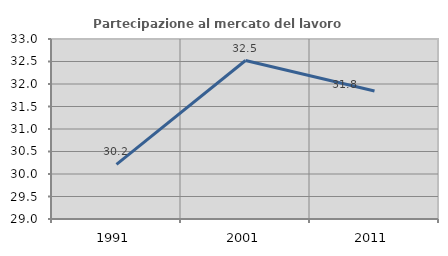
| Category | Partecipazione al mercato del lavoro  femminile |
|---|---|
| 1991.0 | 30.215 |
| 2001.0 | 32.522 |
| 2011.0 | 31.843 |